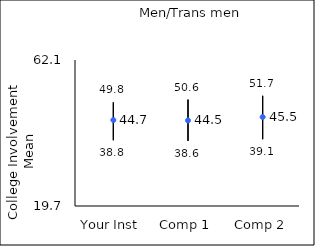
| Category | 25th percentile | 75th percentile | Mean |
|---|---|---|---|
| Your Inst | 38.8 | 49.8 | 44.66 |
| Comp 1 | 38.6 | 50.6 | 44.54 |
| Comp 2 | 39.1 | 51.7 | 45.54 |